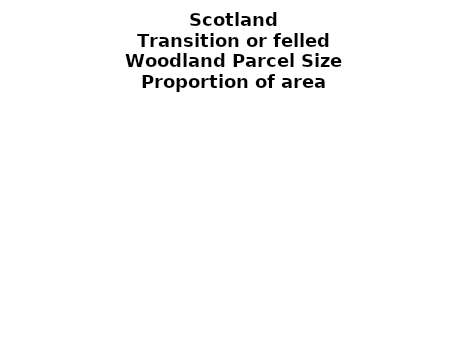
| Category | Transition or felled |
|---|---|
| <5 ha | 0.148 |
| ≥5 and <10 ha | 0.01 |
| ≥10 and <15 ha | 0.013 |
| ≥15 and <20 ha | 0.004 |
| ≥20 and <25 ha | 0.009 |
| ≥25 and <30 ha | 0.015 |
| ≥30 and <35 ha | 0.011 |
| ≥35 and <40 ha | 0.001 |
| ≥40 and <45 ha | 0.005 |
| ≥45 and <50 ha | 0.004 |
| ≥50 and <60 ha | 0.021 |
| ≥60 and <70 ha | 0.012 |
| ≥70 and <80 ha | 0.015 |
| ≥80 and <90 ha | 0.013 |
| ≥90 and <100 ha | 0.006 |
| ≥100 and <150 ha | 0.018 |
| ≥150 and <200 ha | 0.031 |
| ≥200 ha | 0.663 |